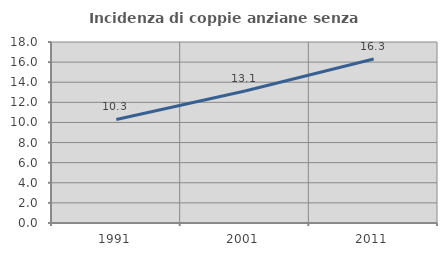
| Category | Incidenza di coppie anziane senza figli  |
|---|---|
| 1991.0 | 10.294 |
| 2001.0 | 13.132 |
| 2011.0 | 16.317 |